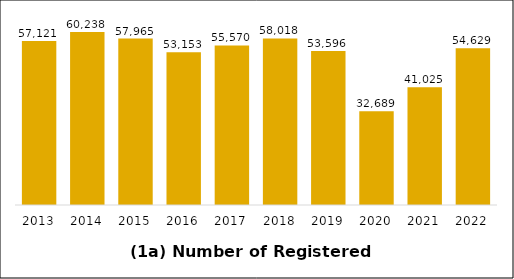
| Category | Series 0 |
|---|---|
| 2013.0 | 57121 |
| 2014.0 | 60238 |
| 2015.0 | 57965 |
| 2016.0 | 53153 |
| 2017.0 | 55570 |
| 2018.0 | 58018 |
| 2019.0 | 53596 |
| 2020.0 | 32689 |
| 2021.0 | 41025 |
| 2022.0 | 54629 |